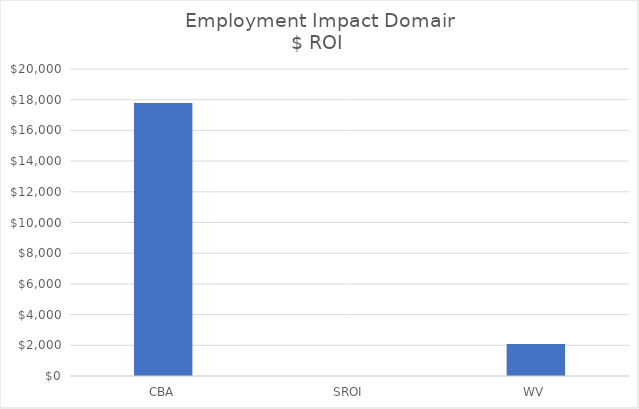
| Category | Employment  |
|---|---|
| CBA | 17784 |
| SROI | 0 |
| WV | 2089.3 |